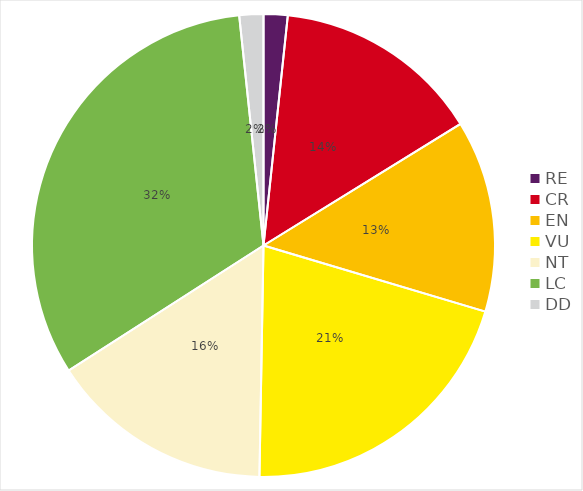
| Category | RE CR EN VU NT LC DD |
|---|---|
| RE | 0.017 |
| CR | 0.145 |
| EN | 0.134 |
| VU | 0.207 |
| NT | 0.156 |
| LC | 0.324 |
| DD | 0.017 |